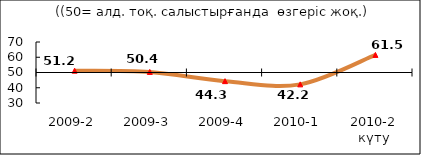
| Category | Диф.индекс ↓ |
|---|---|
| 2009-2 | 51.18 |
| 2009-3 | 50.375 |
| 2009-4 | 44.335 |
| 2010-1 | 42.22 |
| 2010-2 күту | 61.535 |